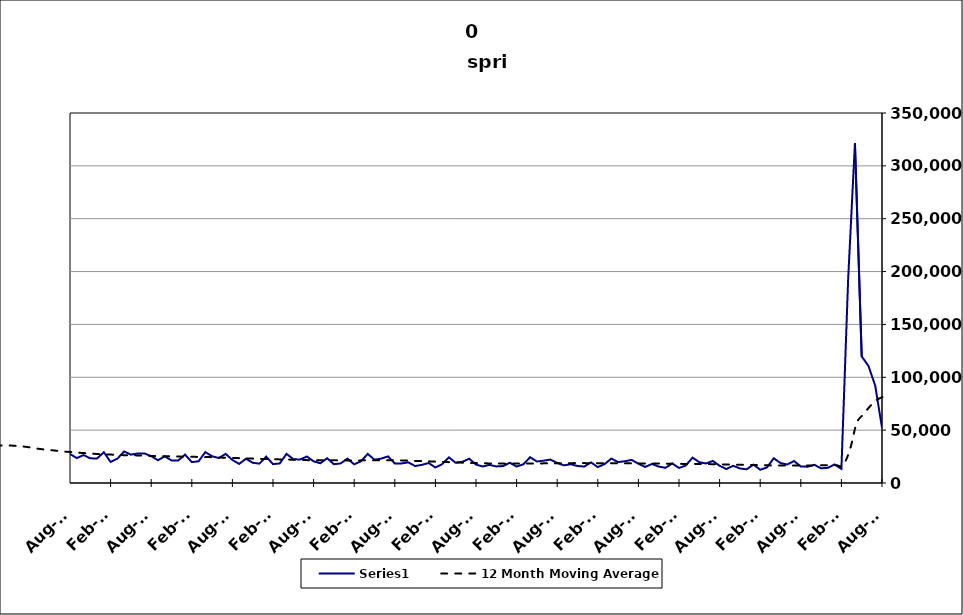
| Category | Series 0 |
|---|---|
| 2005-06-30 | 15559 |
| 2005-07-31 | 18863 |
| 2005-08-31 | 13688 |
| 2005-09-30 | 11216 |
| 2005-10-31 | 15195 |
| 2005-11-30 | 11106 |
| 2005-12-31 | 12178 |
| 2006-01-31 | 12307 |
| 2006-02-28 | 9756 |
| 2006-03-31 | 11166 |
| 2006-04-30 | 18194 |
| 2006-05-31 | 13863 |
| 2006-06-30 | 14337 |
| 2006-07-31 | 17845 |
| 2006-08-31 | 13259 |
| 2006-09-30 | 13170 |
| 2006-10-31 | 14318 |
| 2006-11-30 | 12528 |
| 2006-12-31 | 14662 |
| 2007-01-31 | 14365 |
| 2007-02-28 | 12004 |
| 2007-03-31 | 15715 |
| 2007-04-30 | 21487 |
| 2007-05-31 | 15927 |
| 2007-06-30 | 20117 |
| 2007-07-30 | 19634 |
| 2007-08-31 | 15908 |
| 2007-09-30 | 17289 |
| 2007-10-31 | 17016 |
| 2007-11-15 | 14868 |
| 2007-12-15 09:36:00 | 15051 |
| 2008-01-14 19:12:00 | 19519 |
| 2008-02-14 04:48:00 | 17071 |
| 2008-03-15 14:24:00 | 18041 |
| 2008-04-15 | 26337 |
| 2008-05-15 09:36:00 | 21529 |
| 2008-06-14 19:12:00 | 24509 |
| 2008-07-15 04:48:00 | 26739 |
| 2008-08-14 14:24:00 | 22508 |
| 2008-09-14 | 24197 |
| 2008-10-14 09:36:00 | 30666 |
| 2008-11-13 19:12:00 | 30363 |
| 2008-12-14 04:48:00 | 34409 |
| 2009-01-13 14:24:00 | 39076 |
| 2009-02-13 | 34958 |
| 2009-03-15 09:36:00 | 39174 |
| 2009-04-14 19:12:00 | 41068 |
| 2009-05-15 04:48:00 | 34839 |
| 2009-06-14 14:24:00 | 38758 |
| 2009-07-15 | 38827 |
| 2009-08-14 09:36:00 | 32747 |
| 2009-09-13 19:12:00 | 30654 |
| 2009-10-14 04:48:00 | 31279 |
| 2009-11-13 14:24:00 | 28764 |
| 2009-12-14 | 28567 |
| 2010-01-13 09:36:00 | 31536 |
| 2010-02-12 19:12:00 | 23411 |
| 2010-03-15 04:48:00 | 27064 |
| 2010-04-14 14:24:00 | 31806 |
| 2010-05-15 | 27535 |
| 2010-06-14 09:36:00 | 30999 |
| 2010-07-14 19:12:00 | 30859 |
| 2010-08-14 04:48:00 | 27473 |
| 2010-09-13 14:24:00 | 23569 |
| 2010-10-14 | 26397 |
| 2010-11-13 09:36:00 | 23332 |
| 2010-12-13 19:12:00 | 23208 |
| 2011-01-13 04:48:00 | 29123 |
| 2011-02-12 14:24:00 | 19880 |
| 2011-03-15 | 23037 |
| 2011-04-14 09:36:00 | 29838 |
| 2011-05-14 19:12:00 | 26805 |
| 2011-06-14 04:48:00 | 27951 |
| 2011-07-14 14:24:00 | 27959 |
| 2011-08-14 | 25368 |
| 2011-09-13 09:36:00 | 21516 |
| 2011-10-13 19:12:00 | 25249 |
| 2011-11-13 04:48:00 | 21348 |
| 2011-12-13 14:24:00 | 21373 |
| 2012-01-13 | 26870 |
| 2012-02-12 09:36:00 | 19799 |
| 2012-03-13 19:12:00 | 20523 |
| 2012-04-13 04:48:00 | 29208 |
| 2012-05-13 14:24:00 | 25322 |
| 2012-06-13 | 23562 |
| 2012-07-13 09:36:00 | 27564 |
| 2012-08-12 19:12:00 | 21787 |
| 2012-09-12 04:48:00 | 18024 |
| 2012-10-12 14:24:00 | 22967 |
| 2012-11-12 | 19147 |
| 2012-12-12 09:36:00 | 18332 |
| 2013-01-11 19:12:00 | 24929 |
| 2013-02-11 04:48:00 | 17864 |
| 2013-03-13 14:24:00 | 18518 |
| 2013-04-13 | 27564 |
| 2013-05-13 09:36:00 | 22544 |
| 2013-06-12 19:12:00 | 22178 |
| 2013-07-13 04:48:00 | 25052 |
| 2013-08-12 14:24:00 | 20510 |
| 2013-09-12 | 18652 |
| 2013-10-12 09:36:00 | 23457 |
| 2013-11-11 19:12:00 | 17762 |
| 2013-12-12 04:48:00 | 18554 |
| 2014-01-11 14:24:00 | 23110 |
| 2014-02-11 | 17656 |
| 2014-03-13 09:36:00 | 20574 |
| 2014-04-12 19:12:00 | 27528 |
| 2014-05-13 04:48:00 | 22003 |
| 2014-06-12 14:24:00 | 23093 |
| 2014-07-13 | 25159 |
| 2014-08-12 09:36:00 | 18501 |
| 2014-09-11 19:12:00 | 18519 |
| 2014-10-12 04:48:00 | 19501 |
| 2014-11-11 14:24:00 | 16036 |
| 2014-12-12 | 17142 |
| 2015-01-11 09:36:00 | 18920 |
| 2015-02-10 19:12:00 | 14673 |
| 2015-03-13 04:48:00 | 17842 |
| 2015-04-12 14:24:00 | 24284 |
| 2015-05-13 | 19120 |
| 2015-06-12 09:36:00 | 20073 |
| 2015-07-12 19:12:00 | 23007 |
| 2015-08-12 04:48:00 | 17420 |
| 2015-09-11 14:24:00 | 15620 |
| 2015-10-12 | 17117 |
| 2015-11-11 09:36:00 | 15685 |
| 2015-12-11 19:12:00 | 16020 |
| 2016-01-11 04:48:00 | 19143 |
| 2016-02-10 14:24:00 | 15551 |
| 2016-03-12 | 17721 |
| 2016-04-11 09:36:00 | 24381 |
| 2016-05-11 19:12:00 | 20319 |
| 2016-06-11 04:48:00 | 21157 |
| 2016-07-11 14:24:00 | 22155 |
| 2016-08-11 | 18945 |
| 2016-09-10 09:36:00 | 16699 |
| 2016-10-10 19:12:00 | 17773 |
| 2016-11-10 04:48:00 | 16104 |
| 2016-12-10 14:24:00 | 15555 |
| 2017-01-10 | 19468 |
| 2017-02-09 09:36:00 | 15031 |
| 2017-03-11 19:12:00 | 17840 |
| 2017-04-11 04:48:00 | 23124 |
| 2017-05-11 14:24:00 | 19802 |
| 2017-06-11 | 20588 |
| 2017-07-11 09:36:00 | 21858 |
| 2017-08-10 19:12:00 | 18231 |
| 2017-09-10 04:48:00 | 15171 |
| 2017-10-10 14:24:00 | 18027 |
| 2017-11-10 | 15538 |
| 2017-12-10 09:36:00 | 14339 |
| 2018-01-09 19:12:00 | 18538 |
| 2018-02-09 04:48:00 | 14230 |
| 2018-03-11 14:24:00 | 16525 |
| 2018-04-11 | 23962 |
| 2018-05-11 09:36:00 | 19679 |
| 2018-06-10 19:12:00 | 18492 |
| 2018-07-11 04:48:00 | 20879 |
| 2018-08-10 14:24:00 | 16306 |
| 2018-09-10 | 13227 |
| 2018-10-10 09:36:00 | 16273 |
| 2018-11-09 19:12:00 | 13796 |
| 2018-12-10 04:48:00 | 12964 |
| 2019-01-09 14:24:00 | 17391 |
| 2019-02-09 | 12534 |
| 2019-03-11 09:36:00 | 14705 |
| 2019-04-10 19:12:00 | 23399 |
| 2019-05-11 04:48:00 | 18895 |
| 2019-06-10 14:24:00 | 17486 |
| 2019-07-11 | 20792 |
| 2019-08-10 09:36:00 | 15676 |
| 2019-09-09 19:12:00 | 15415 |
| 2019-10-10 04:48:00 | 17202 |
| 2019-11-09 14:24:00 | 13905 |
| 2019-12-10 | 14356 |
| 2020-01-09 09:36:00 | 17551 |
| 2020-02-08 19:12:00 | 13374 |
| 2020-03-10 04:48:00 | 193236 |
| 2020-04-09 14:24:00 | 321397 |
| 2020-05-10 | 119809 |
| 2020-06-09 09:36:00 | 110709 |
| 2020-07-09 19:12:00 | 91992 |
| 2020-08-09 04:48:00 | 52303 |